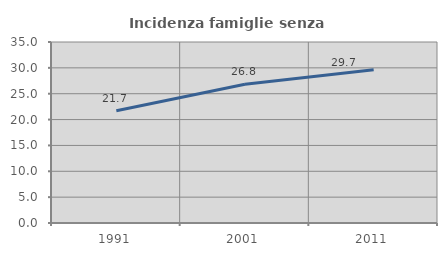
| Category | Incidenza famiglie senza nuclei |
|---|---|
| 1991.0 | 21.693 |
| 2001.0 | 26.828 |
| 2011.0 | 29.651 |